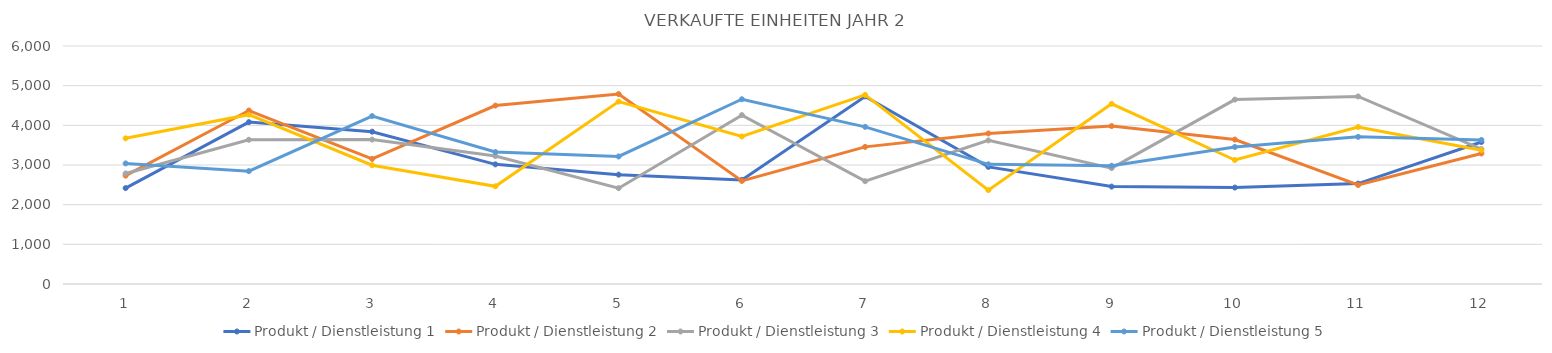
| Category | Produkt / Dienstleistung 1 | Produkt / Dienstleistung 2 | Produkt / Dienstleistung 3 | Produkt / Dienstleistung 4 | Produkt / Dienstleistung 5 |
|---|---|---|---|---|---|
| 0 | 2418 | 2732 | 2786 | 3672 | 3039 |
| 1 | 4081 | 4373 | 3636 | 4269 | 2845 |
| 2 | 3840 | 3155 | 3640 | 2995 | 4234 |
| 3 | 3016 | 4498 | 3226 | 2463 | 3327 |
| 4 | 2757 | 4788 | 2416 | 4599 | 3215 |
| 5 | 2625 | 2598 | 4258 | 3719 | 4658 |
| 6 | 4729 | 3457 | 2592 | 4768 | 3962 |
| 7 | 2952 | 3795 | 3620 | 2366 | 3017 |
| 8 | 2456 | 3981 | 2921 | 4542 | 2982 |
| 9 | 2431 | 3641 | 4649 | 3126 | 3454 |
| 10 | 2531 | 2495 | 4729 | 3958 | 3710 |
| 11 | 3580 | 3291 | 3400 | 3372 | 3632 |